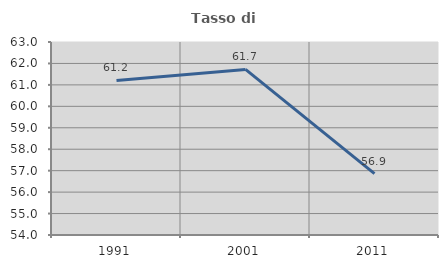
| Category | Tasso di occupazione   |
|---|---|
| 1991.0 | 61.205 |
| 2001.0 | 61.72 |
| 2011.0 | 56.862 |